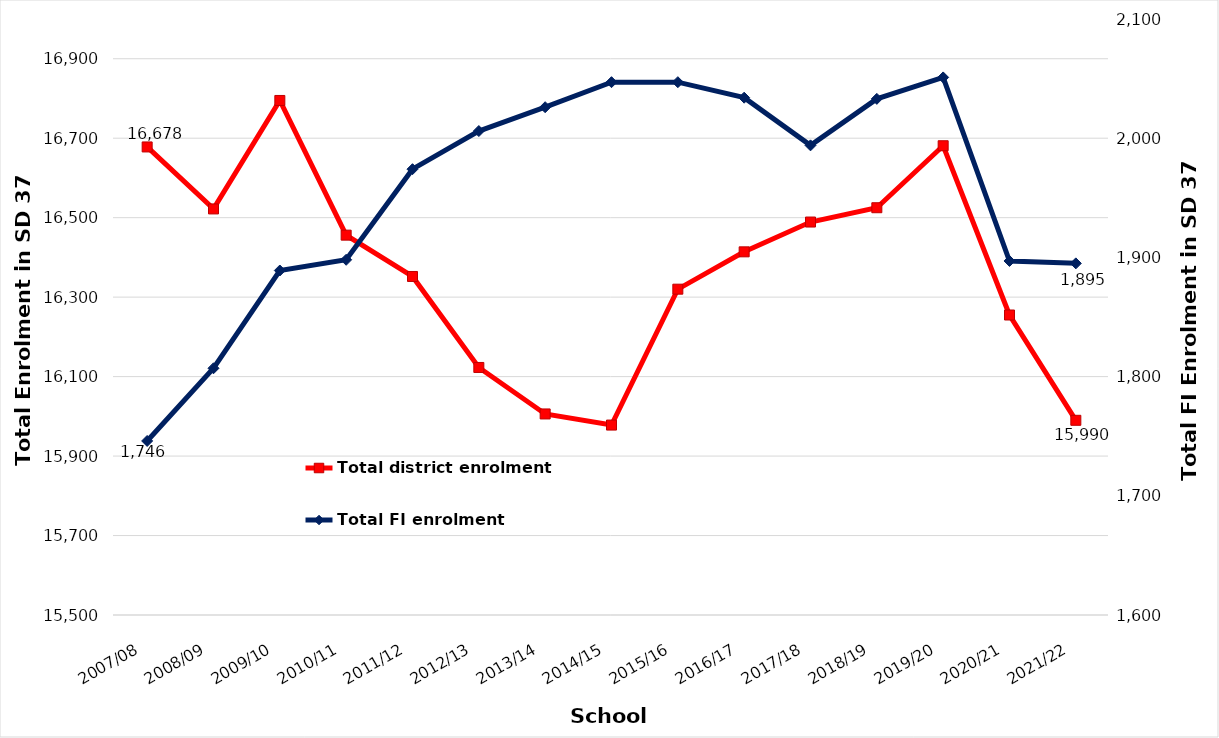
| Category | Total district enrolment  |
|---|---|
| 2007/08 | 16678 |
| 2008/09 | 16522 |
| 2009/10 | 16795 |
| 2010/11 | 16456 |
| 2011/12 | 16352 |
| 2012/13 | 16123 |
| 2013/14 | 16006 |
| 2014/15 | 15978 |
| 2015/16 | 16320 |
| 2016/17 | 16414 |
| 2017/18 | 16489 |
| 2018/19 | 16525 |
| 2019/20 | 16681 |
| 2020/21 | 16255 |
| 2021/22 | 15990 |